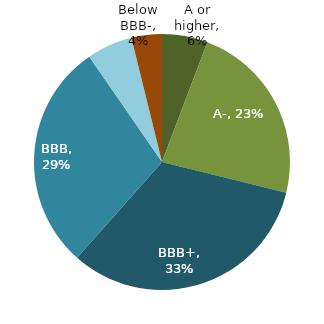
| Category | Series 0 |
|---|---|
| A or higher | 0.058 |
| A- | 0.231 |
| BBB+ | 0.327 |
| BBB | 0.288 |
| BBB- | 0.058 |
| Below BBB- | 0.038 |